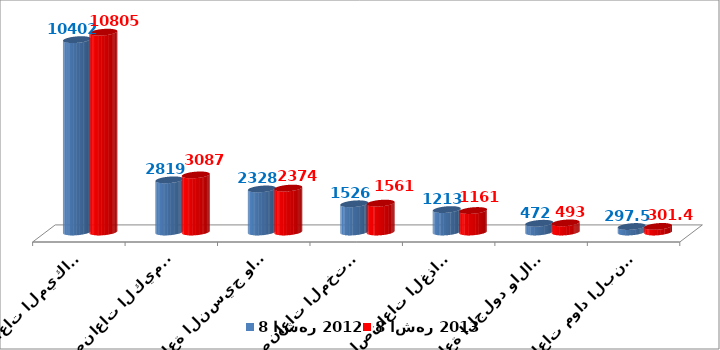
| Category | 8 اشهر 2012 | 8 اشهر 2013 |
|---|---|---|
| الصناعات الميكانيكية والكهربائية | 10402 | 10805.38 |
| الصناعات الكيميائية | 2819.169 | 3086.506 |
| صناعة النسيج والملابس | 2327.8 | 2374.2 |
| الصناعات المختلفة | 1525.974 | 1561.383 |
| الصناعات الغذائية | 1213.085 | 1161.205 |
| صناعة الجلود والاحذية | 471.5 | 492.5 |
| صناعات مواد البناء والخزف والبلور | 297.516 | 301.421 |